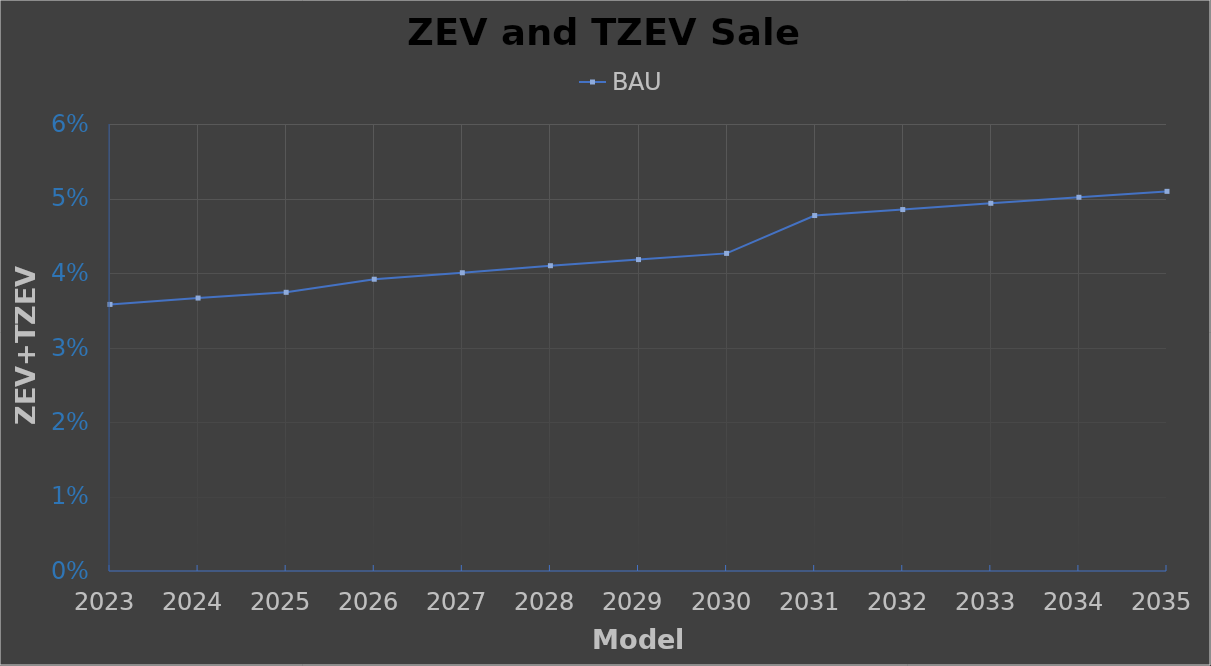
| Category | BAU |
|---|---|
| 2023.0 | 0.036 |
| 2024.0 | 0.037 |
| 2025.0 | 0.037 |
| 2026.0 | 0.039 |
| 2027.0 | 0.04 |
| 2028.0 | 0.041 |
| 2029.0 | 0.042 |
| 2030.0 | 0.043 |
| 2031.0 | 0.048 |
| 2032.0 | 0.049 |
| 2033.0 | 0.049 |
| 2034.0 | 0.05 |
| 2035.0 | 0.051 |